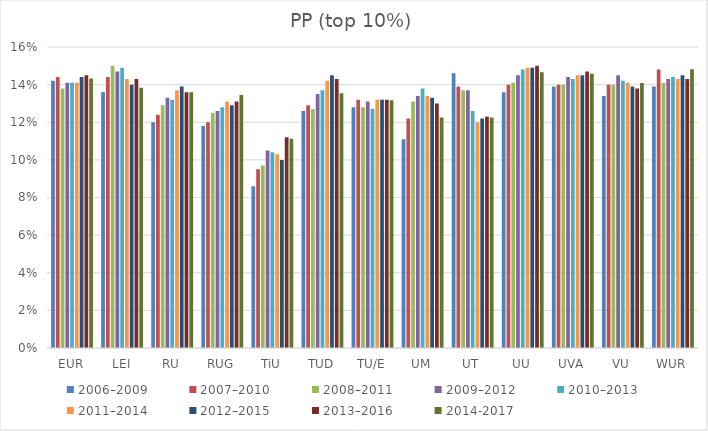
| Category | 2006–2009 | 2007–2010 | 2008–2011 | 2009–2012 | 2010–2013 | 2011–2014 | 2012–2015 | 2013–2016 | 2014-2017 |
|---|---|---|---|---|---|---|---|---|---|
| EUR | 14.2 | 14.4 | 13.8 | 14.1 | 14.1 | 14.1 | 14.4 | 14.5 | 14.328 |
| LEI | 13.6 | 14.4 | 15 | 14.7 | 14.9 | 14.3 | 14 | 14.3 | 13.839 |
| RU | 12 | 12.4 | 12.9 | 13.3 | 13.2 | 13.7 | 13.9 | 13.6 | 13.593 |
| RUG | 11.8 | 12 | 12.5 | 12.6 | 12.8 | 13.1 | 12.9 | 13.1 | 13.448 |
| TiU | 8.6 | 9.5 | 9.7 | 10.5 | 10.4 | 10.3 | 10 | 11.2 | 11.123 |
| TUD | 12.6 | 12.9 | 12.7 | 13.5 | 13.7 | 14.2 | 14.5 | 14.3 | 13.539 |
| TU/E | 12.8 | 13.2 | 12.8 | 13.1 | 12.7 | 13.2 | 13.2 | 13.2 | 13.171 |
| UM | 11.1 | 12.2 | 13.1 | 13.4 | 13.8 | 13.4 | 13.3 | 13 | 12.256 |
| UT | 14.6 | 13.9 | 13.7 | 13.7 | 12.6 | 12 | 12.2 | 12.3 | 12.246 |
| UU | 13.6 | 14 | 14.1 | 14.5 | 14.8 | 14.9 | 14.9 | 15 | 14.659 |
| UVA | 13.9 | 14 | 14 | 14.4 | 14.3 | 14.5 | 14.5 | 14.7 | 14.584 |
| VU | 13.4 | 14 | 14 | 14.5 | 14.2 | 14.1 | 13.9 | 13.8 | 14.092 |
| WUR | 13.9 | 14.8 | 14.1 | 14.3 | 14.4 | 14.3 | 14.5 | 14.3 | 14.824 |